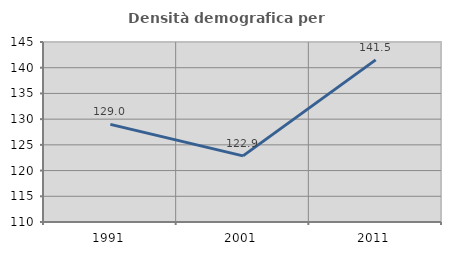
| Category | Densità demografica |
|---|---|
| 1991.0 | 128.982 |
| 2001.0 | 122.853 |
| 2011.0 | 141.518 |